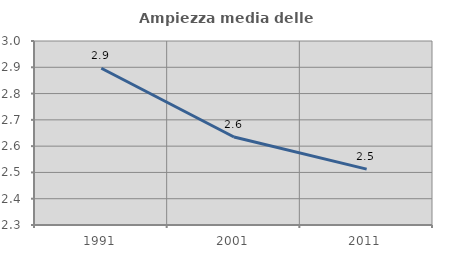
| Category | Ampiezza media delle famiglie |
|---|---|
| 1991.0 | 2.896 |
| 2001.0 | 2.635 |
| 2011.0 | 2.513 |